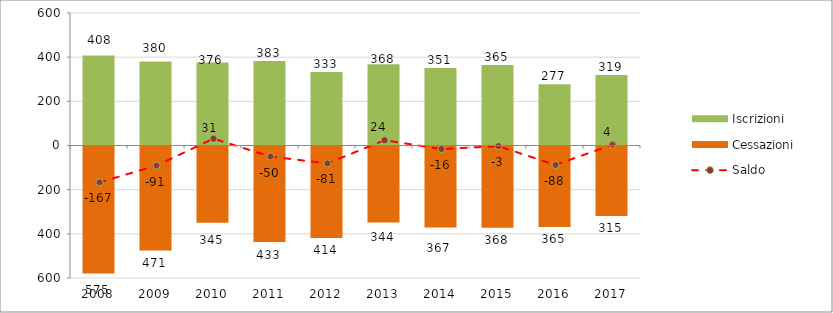
| Category | Iscrizioni | Cessazioni |
|---|---|---|
| 2008.0 | 408 | -575 |
| 2009.0 | 380 | -471 |
| 2010.0 | 376 | -345 |
| 2011.0 | 383 | -433 |
| 2012.0 | 333 | -414 |
| 2013.0 | 368 | -344 |
| 2014.0 | 351 | -367 |
| 2015.0 | 365 | -368 |
| 2016.0 | 277 | -365 |
| 2017.0 | 319 | -315 |